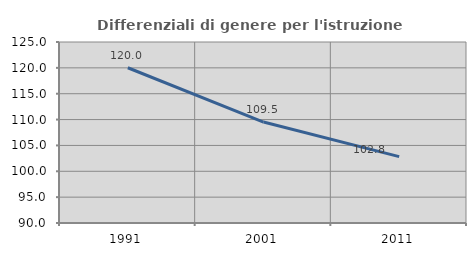
| Category | Differenziali di genere per l'istruzione superiore |
|---|---|
| 1991.0 | 120.018 |
| 2001.0 | 109.524 |
| 2011.0 | 102.84 |